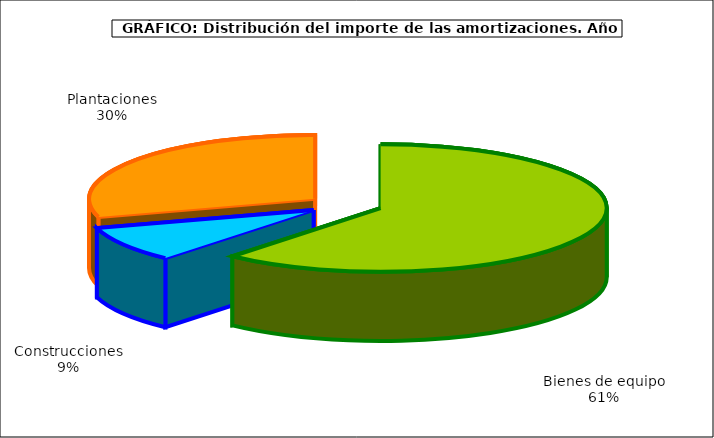
| Category | Series 0 |
|---|---|
| Bienes de equipo | 3385.909 |
| Construcciones | 497.652 |
| Plantaciones | 1632.667 |